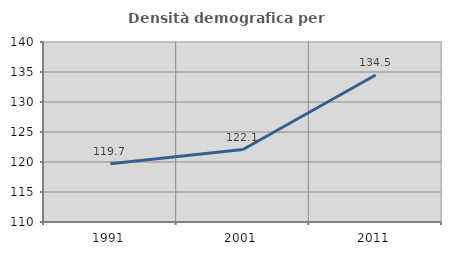
| Category | Densità demografica |
|---|---|
| 1991.0 | 119.71 |
| 2001.0 | 122.073 |
| 2011.0 | 134.505 |